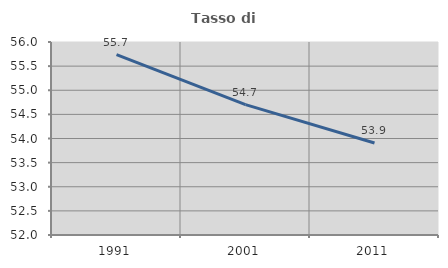
| Category | Tasso di occupazione   |
|---|---|
| 1991.0 | 55.739 |
| 2001.0 | 54.701 |
| 2011.0 | 53.907 |